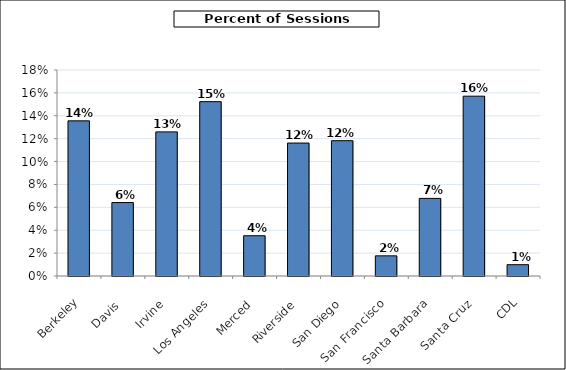
| Category | Sessions requested (by campus) |
|---|---|
| Berkeley | 0.136 |
| Davis | 0.064 |
| Irvine | 0.126 |
| Los Angeles | 0.152 |
| Merced | 0.035 |
| Riverside | 0.116 |
| San Diego | 0.118 |
| San Francisco | 0.018 |
| Santa Barbara | 0.068 |
| Santa Cruz | 0.157 |
| CDL | 0.01 |